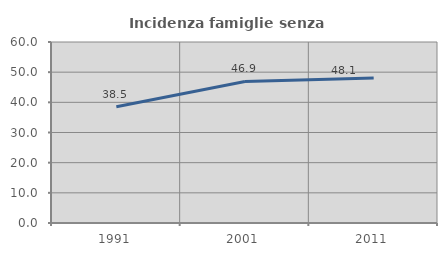
| Category | Incidenza famiglie senza nuclei |
|---|---|
| 1991.0 | 38.542 |
| 2001.0 | 46.914 |
| 2011.0 | 48.101 |